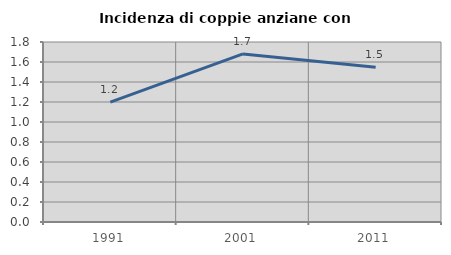
| Category | Incidenza di coppie anziane con figli |
|---|---|
| 1991.0 | 1.199 |
| 2001.0 | 1.681 |
| 2011.0 | 1.548 |